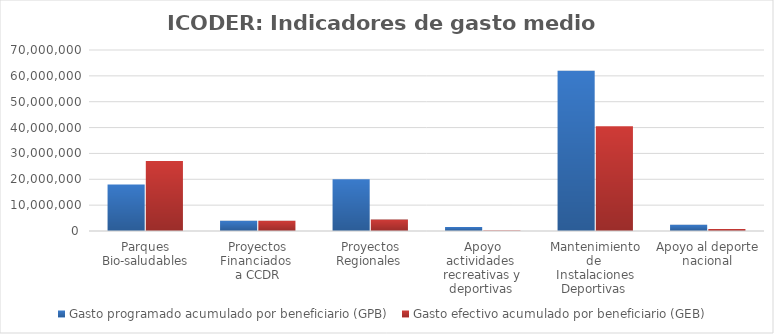
| Category | Gasto programado acumulado por beneficiario (GPB)  | Gasto efectivo acumulado por beneficiario (GEB)  |
|---|---|---|
| Parques Bio-saludables | 18000000 | 27038333.333 |
| Proyectos Financiados 
a CCDR | 4000000 | 4000000 |
| Proyectos Regionales  | 20000000 | 4403792.827 |
| Apoyo actividades 
recreativas y deportivas  | 1536000 | 232503.482 |
| Mantenimiento de 
Instalaciones Deportivas  | 61970903.108 | 40530338.906 |
| Apoyo al deporte nacional | 2424291.294 | 796537.377 |